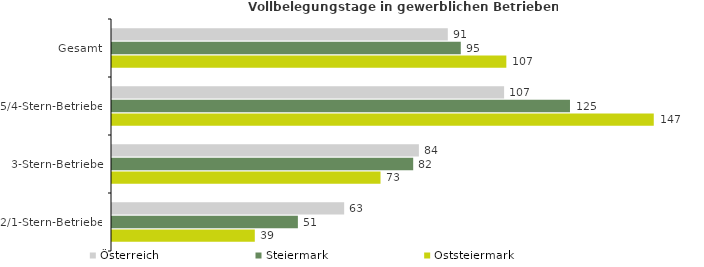
| Category | Österreich | Steiermark | Oststeiermark |
|---|---|---|---|
| Gesamt | 91.375 | 94.907 | 107.303 |
| 5/4-Stern-Betriebe | 106.695 | 124.622 | 147.42 |
| 3-Stern-Betriebe | 83.508 | 81.957 | 73.064 |
| 2/1-Stern-Betriebe | 63.173 | 50.58 | 38.856 |